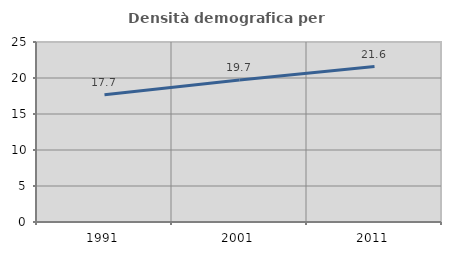
| Category | Densità demografica |
|---|---|
| 1991.0 | 17.679 |
| 2001.0 | 19.726 |
| 2011.0 | 21.59 |